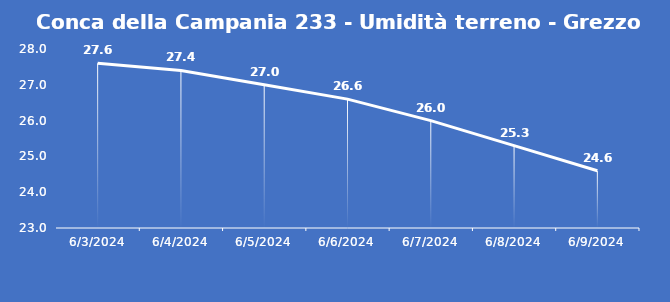
| Category | Conca della Campania 233 - Umidità terreno - Grezzo (%VWC) |
|---|---|
| 6/3/24 | 27.6 |
| 6/4/24 | 27.4 |
| 6/5/24 | 27 |
| 6/6/24 | 26.6 |
| 6/7/24 | 26 |
| 6/8/24 | 25.3 |
| 6/9/24 | 24.6 |